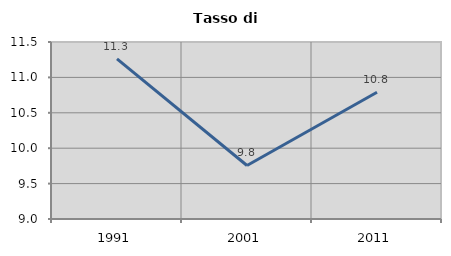
| Category | Tasso di disoccupazione   |
|---|---|
| 1991.0 | 11.262 |
| 2001.0 | 9.756 |
| 2011.0 | 10.79 |